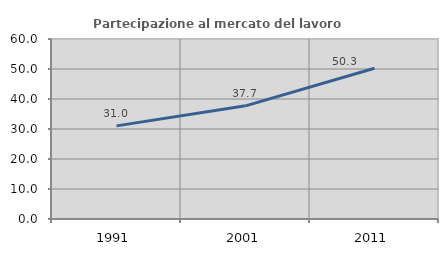
| Category | Partecipazione al mercato del lavoro  femminile |
|---|---|
| 1991.0 | 31.045 |
| 2001.0 | 37.724 |
| 2011.0 | 50.261 |